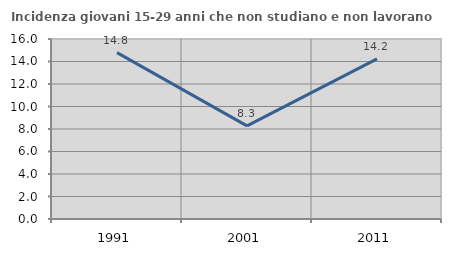
| Category | Incidenza giovani 15-29 anni che non studiano e non lavorano  |
|---|---|
| 1991.0 | 14.786 |
| 2001.0 | 8.273 |
| 2011.0 | 14.23 |